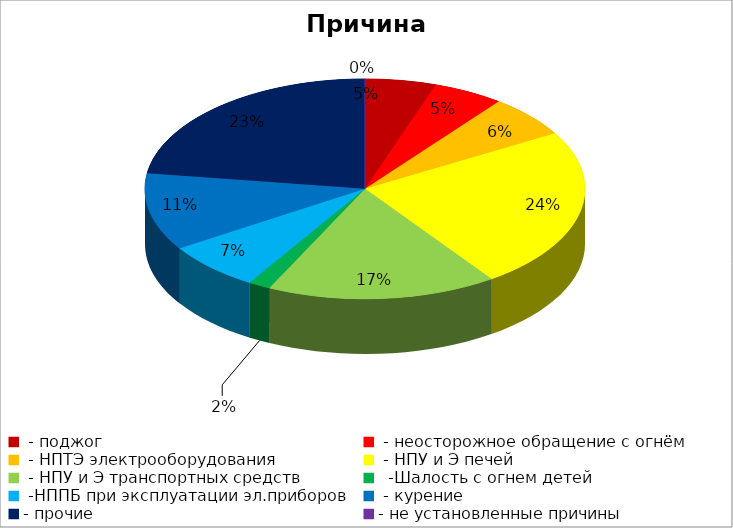
| Category | Причина пожара |
|---|---|
|  - поджог | 16 |
|  - неосторожное обращение с огнём | 16 |
|  - НПТЭ электрооборудования | 19 |
|  - НПУ и Э печей | 73 |
|  - НПУ и Э транспортных средств | 52 |
|   -Шалость с огнем детей | 5 |
|  -НППБ при эксплуатации эл.приборов | 22 |
|  - курение | 35 |
| - прочие | 70 |
| - не установленные причины | 0 |